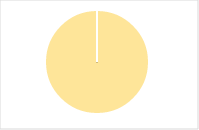
| Category | Total |
|---|---|
| Y | 0 |
| R | 0 |
| T | 0 |
| M | 0 |
| F | 0 |
| N | 158 |